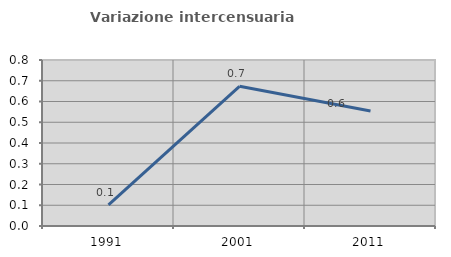
| Category | Variazione intercensuaria annua |
|---|---|
| 1991.0 | 0.102 |
| 2001.0 | 0.673 |
| 2011.0 | 0.554 |